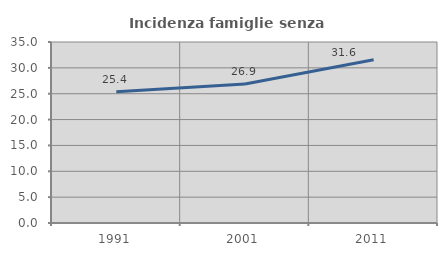
| Category | Incidenza famiglie senza nuclei |
|---|---|
| 1991.0 | 25.367 |
| 2001.0 | 26.886 |
| 2011.0 | 31.584 |